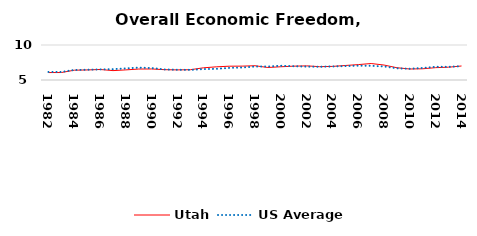
| Category | Utah | US Average |
|---|---|---|
| 1982.0 | 6.065 | 6.149 |
| 1983.0 | 6.067 | 6.152 |
| 1984.0 | 6.398 | 6.429 |
| 1985.0 | 6.437 | 6.464 |
| 1986.0 | 6.503 | 6.512 |
| 1987.0 | 6.341 | 6.552 |
| 1988.0 | 6.445 | 6.659 |
| 1989.0 | 6.565 | 6.767 |
| 1990.0 | 6.576 | 6.71 |
| 1991.0 | 6.474 | 6.502 |
| 1992.0 | 6.443 | 6.463 |
| 1993.0 | 6.471 | 6.446 |
| 1994.0 | 6.74 | 6.563 |
| 1995.0 | 6.88 | 6.593 |
| 1996.0 | 6.973 | 6.73 |
| 1997.0 | 6.98 | 6.781 |
| 1998.0 | 7.037 | 6.926 |
| 1999.0 | 6.786 | 6.925 |
| 2000.0 | 6.891 | 7.031 |
| 2001.0 | 6.976 | 6.969 |
| 2002.0 | 7.02 | 6.912 |
| 2003.0 | 6.905 | 6.892 |
| 2004.0 | 6.944 | 6.934 |
| 2005.0 | 7.072 | 6.99 |
| 2006.0 | 7.2 | 7.048 |
| 2007.0 | 7.354 | 7.028 |
| 2008.0 | 7.134 | 6.935 |
| 2009.0 | 6.749 | 6.668 |
| 2010.0 | 6.571 | 6.605 |
| 2011.0 | 6.605 | 6.72 |
| 2012.0 | 6.764 | 6.883 |
| 2013.0 | 6.829 | 6.881 |
| 2014.0 | 7.001 | 6.973 |